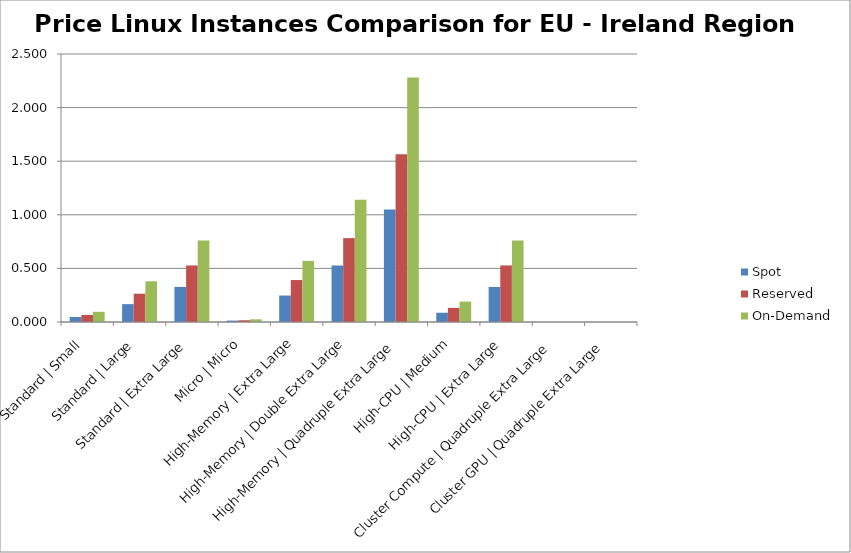
| Category | Spot | Reserved | On-Demand |
|---|---|---|---|
| Standard | Small | 0.047 | 0.066 | 0.095 |
| Standard | Large | 0.167 | 0.264 | 0.38 |
| Standard | Extra Large | 0.327 | 0.528 | 0.76 |
| Micro | Micro | 0.013 | 0.016 | 0.025 |
| High-Memory | Extra Large | 0.247 | 0.391 | 0.57 |
| High-Memory | Double Extra Large | 0.527 | 0.783 | 1.14 |
| High-Memory | Quadruple Extra Large | 1.05 | 1.565 | 2.28 |
| High-CPU | Medium | 0.086 | 0.132 | 0.19 |
| High-CPU | Extra Large | 0.327 | 0.528 | 0.76 |
| Cluster Compute | Quadruple Extra Large | 0 | 0 | 0 |
| Cluster GPU | Quadruple Extra Large | 0 | 0 | 0 |